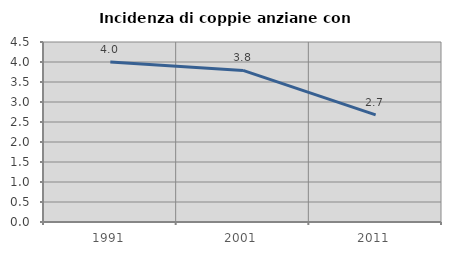
| Category | Incidenza di coppie anziane con figli |
|---|---|
| 1991.0 | 4 |
| 2001.0 | 3.79 |
| 2011.0 | 2.679 |